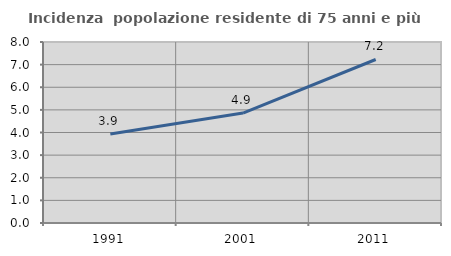
| Category | Incidenza  popolazione residente di 75 anni e più |
|---|---|
| 1991.0 | 3.932 |
| 2001.0 | 4.858 |
| 2011.0 | 7.227 |